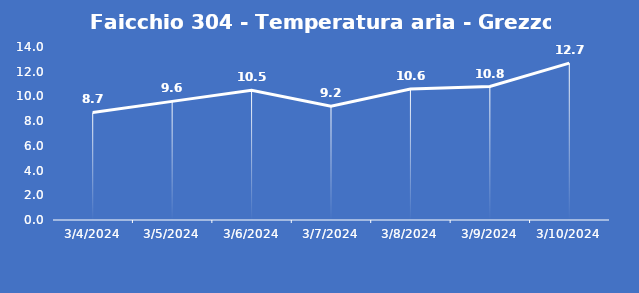
| Category | Faicchio 304 - Temperatura aria - Grezzo (°C) |
|---|---|
| 3/4/24 | 8.7 |
| 3/5/24 | 9.6 |
| 3/6/24 | 10.5 |
| 3/7/24 | 9.2 |
| 3/8/24 | 10.6 |
| 3/9/24 | 10.8 |
| 3/10/24 | 12.7 |